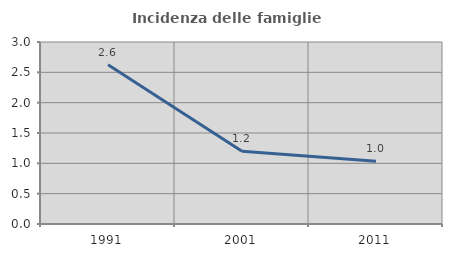
| Category | Incidenza delle famiglie numerose |
|---|---|
| 1991.0 | 2.626 |
| 2001.0 | 1.198 |
| 2011.0 | 1.036 |